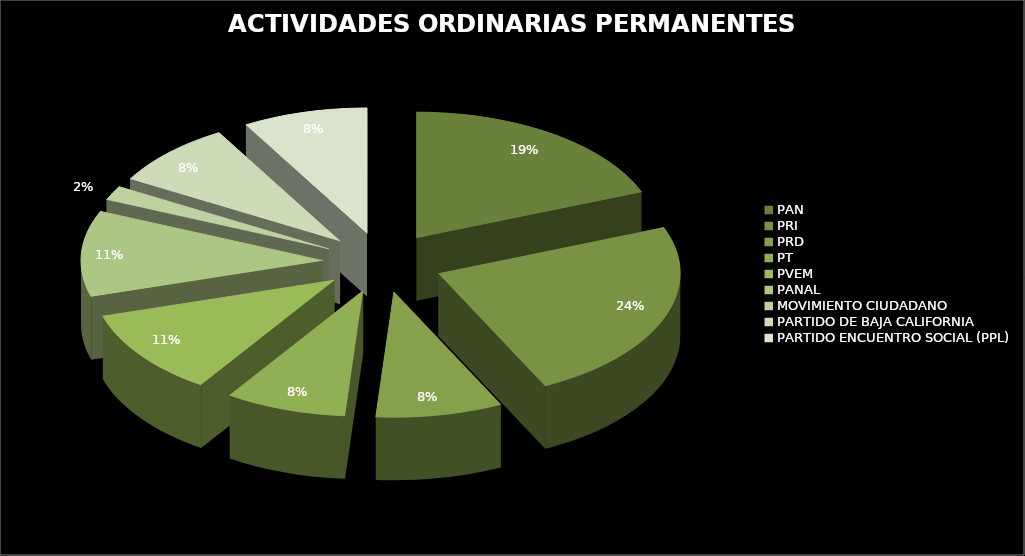
| Category | Series 0 |
|---|---|
| PAN | 2702671.37 |
| PRI | 3360836.81 |
| PRD | 1202434.17 |
| PT | 1150554.89 |
| PVEM | 1570265.26 |
| PANAL | 1570265.26 |
| MOVIMIENTO CIUDADANO | 261222.55 |
| PARTIDO DE BAJA CALIFORNIA | 1189317.07 |
| PARTIDO ENCUENTRO SOCIAL (PPL) | 1185524.63 |